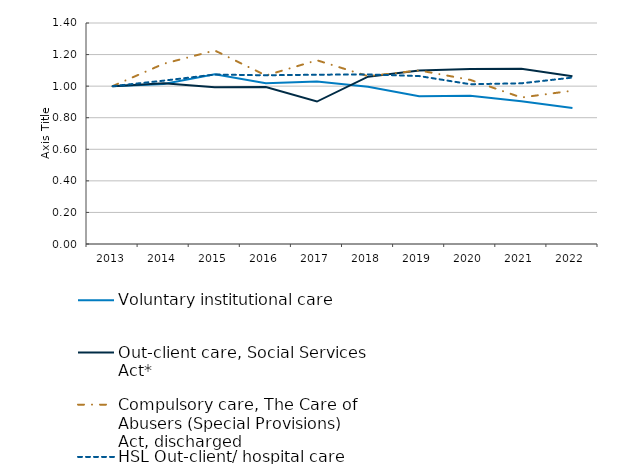
| Category | Voluntary institutional care | Out-client care, Social Services Act* | Compulsory care, The Care of Abusers (Special Provisions) Act, discharged | HSL Out-client/ hospital care  F10-F16, F18-F19
 |
|---|---|---|---|---|
| 2013 | 1 | 1 | 1 | 1 |
| 2014 | 1.014 | 1.018 | 1.142 | 1.035 |
| 2015 | 1.075 | 0.993 | 1.226 | 1.073 |
| 2016 | 1.018 | 0.994 | 1.068 | 1.069 |
| 2017 | 1.029 | 0.902 | 1.164 | 1.072 |
| 2018 | 0.996 | 1.06 | 1.063 | 1.074 |
| 2019 | 0.935 | 1.1 | 1.1 | 1.064 |
| 2020 | 0.939 | 1.109 | 1.04 | 1.012 |
| 2021 | 0.905 | 1.11 | 0.928 | 1.018 |
| 2022 | 0.862 | 1.062 | 0.971 | 1.054 |